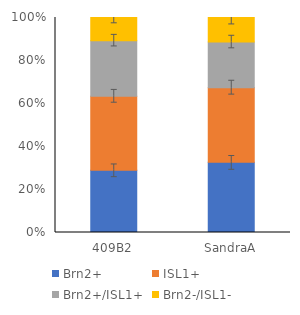
| Category | Brn2+ | ISL1+ | Brn2+/ISL1+ | Brn2-/ISL1- |
|---|---|---|---|---|
| 409B2 | 54.503 | 64.775 | 48.74 | 20.287 |
| SandraA | 56.736 | 60.308 | 36.889 | 19.845 |